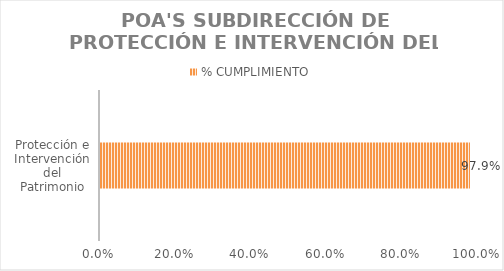
| Category | % CUMPLIMIENTO |
|---|---|
| Protección e Intervención del Patrimonio | 0.979 |